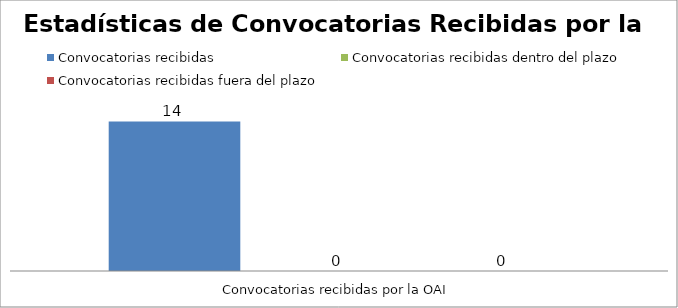
| Category | Convocatorias recibidas | Convocatorias recibidas dentro del plazo | Convocatorias recibidas fuera del plazo |
|---|---|---|---|
| 0 | 14 | 0 | 0 |